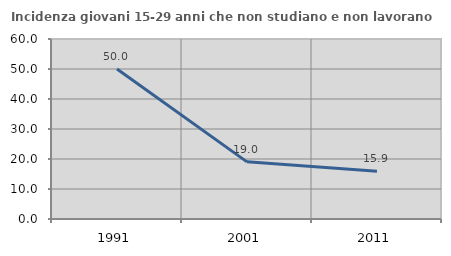
| Category | Incidenza giovani 15-29 anni che non studiano e non lavorano  |
|---|---|
| 1991.0 | 50 |
| 2001.0 | 19.048 |
| 2011.0 | 15.888 |